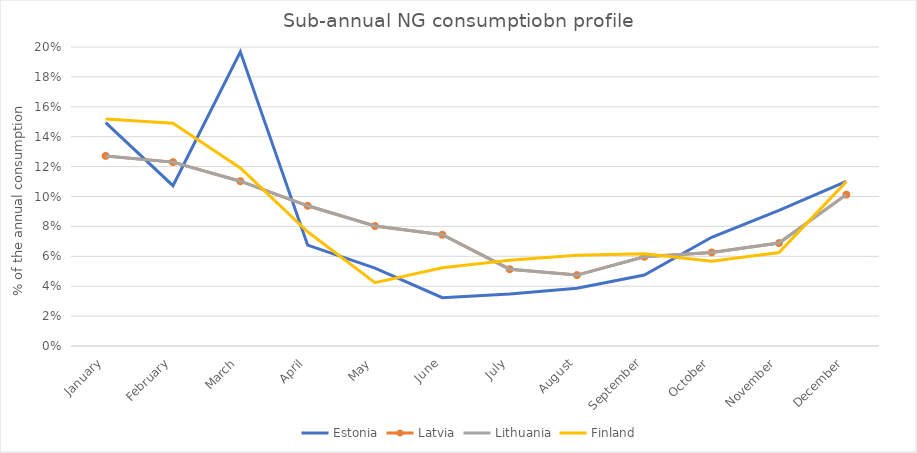
| Category | Estonia | Latvia | Lithuania | Finland |
|---|---|---|---|---|
| January | 0.149 | 0.127 | 0.127 | 0.152 |
| February | 0.107 | 0.123 | 0.123 | 0.149 |
| March | 0.197 | 0.11 | 0.11 | 0.119 |
| April | 0.067 | 0.094 | 0.094 | 0.076 |
| May | 0.052 | 0.08 | 0.08 | 0.042 |
| June | 0.032 | 0.074 | 0.074 | 0.052 |
| July | 0.035 | 0.051 | 0.051 | 0.057 |
| August | 0.039 | 0.047 | 0.047 | 0.061 |
| September | 0.047 | 0.06 | 0.06 | 0.062 |
| October | 0.073 | 0.063 | 0.063 | 0.057 |
| November | 0.091 | 0.069 | 0.069 | 0.063 |
| December | 0.11 | 0.101 | 0.101 | 0.11 |